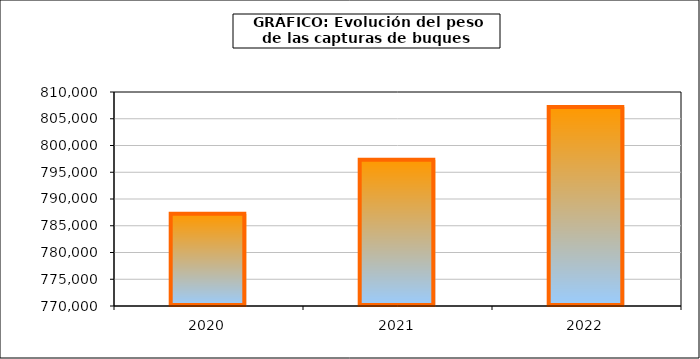
| Category | Series1 |
|---|---|
| 2020.0 | 787257.944 |
| 2021.0 | 797341.83 |
| 2022.0 | 807195.472 |